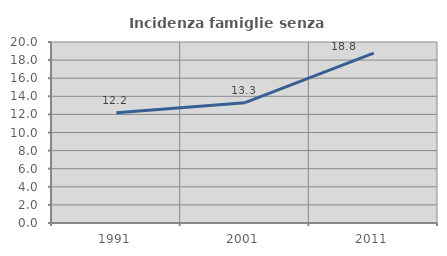
| Category | Incidenza famiglie senza nuclei |
|---|---|
| 1991.0 | 12.178 |
| 2001.0 | 13.291 |
| 2011.0 | 18.767 |